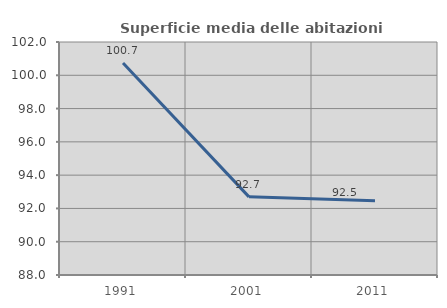
| Category | Superficie media delle abitazioni occupate |
|---|---|
| 1991.0 | 100.735 |
| 2001.0 | 92.695 |
| 2011.0 | 92.46 |